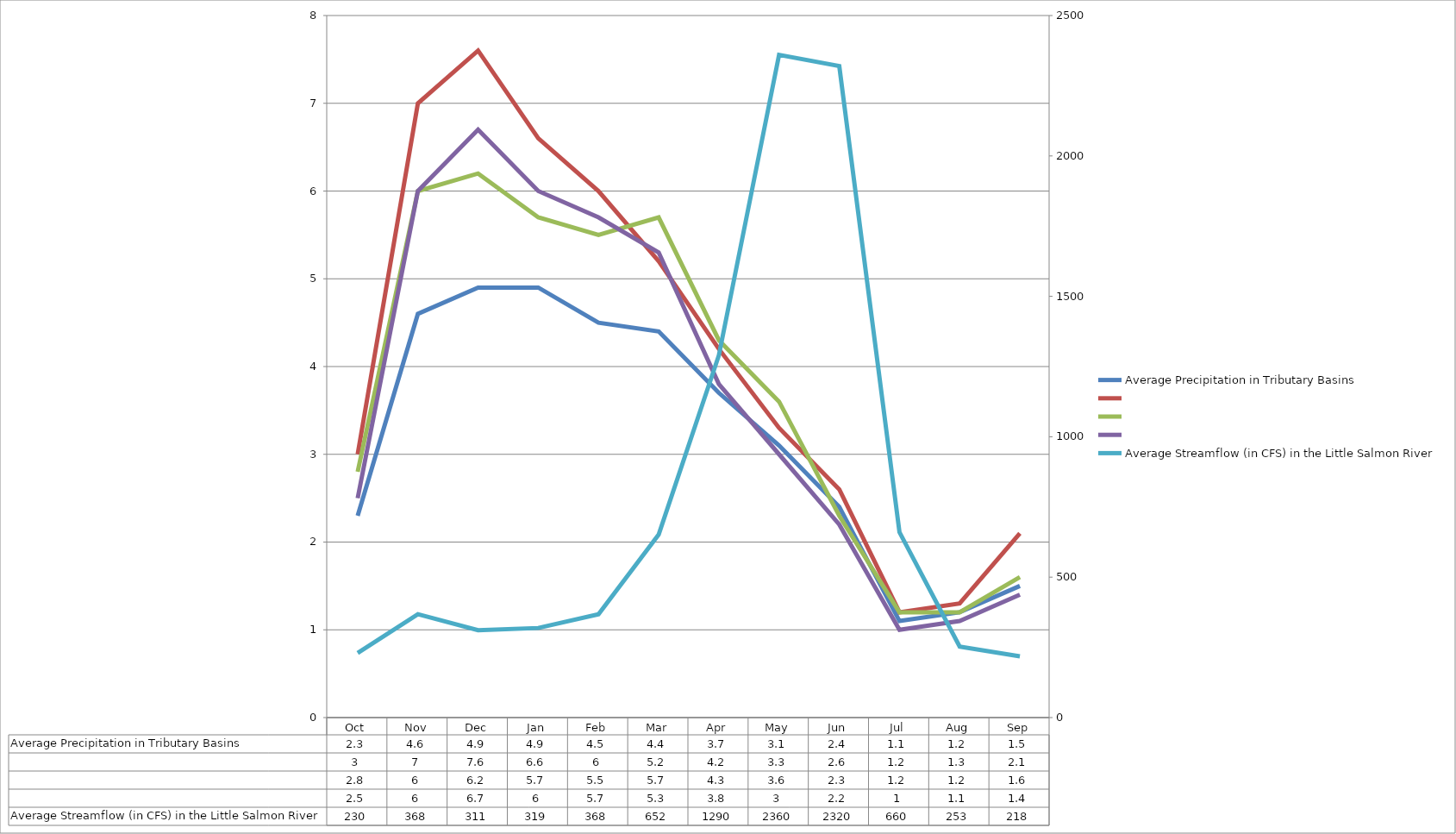
| Category | Average Precipitation in Tributary Basins | Series 1 | Series 2 | Series 3 |
|---|---|---|---|---|
| Oct | 2.3 | 3 | 2.8 | 2.5 |
| Nov | 4.6 | 7 | 6 | 6 |
| Dec | 4.9 | 7.6 | 6.2 | 6.7 |
| Jan | 4.9 | 6.6 | 5.7 | 6 |
| Feb | 4.5 | 6 | 5.5 | 5.7 |
| Mar | 4.4 | 5.2 | 5.7 | 5.3 |
| Apr | 3.7 | 4.2 | 4.3 | 3.8 |
| May | 3.1 | 3.3 | 3.6 | 3 |
| Jun | 2.4 | 2.6 | 2.3 | 2.2 |
| Jul | 1.1 | 1.2 | 1.2 | 1 |
| Aug | 1.2 | 1.3 | 1.2 | 1.1 |
| Sep | 1.5 | 2.1 | 1.6 | 1.4 |